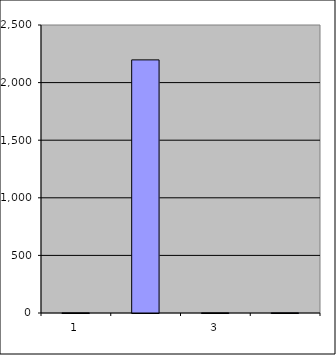
| Category | Series 0 |
|---|---|
| 0 | 1 |
| 1 | 2197.242 |
| 2 | 0.975 |
| 3 | 1.209 |